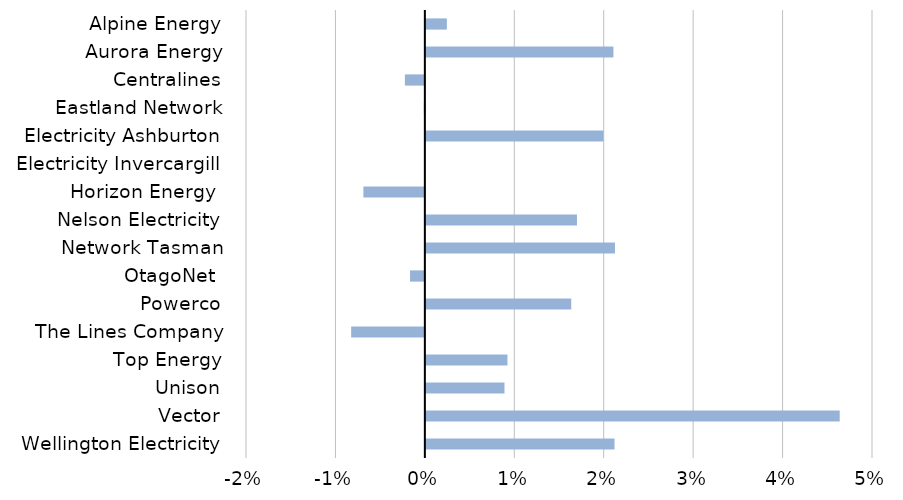
| Category | Series 0 |
|---|---|
| Wellington Electricity | 0.021 |
| Vector | 0.046 |
| Unison | 0.009 |
| Top Energy | 0.009 |
| The Lines Company | -0.008 |
| Powerco | 0.016 |
| OtagoNet  | -0.002 |
| Network Tasman | 0.021 |
| Nelson Electricity | 0.017 |
| Horizon Energy  | -0.007 |
| Electricity Invercargill | 0 |
| Electricity Ashburton | 0.02 |
| Eastland Network | 0 |
| Centralines | -0.002 |
| Aurora Energy | 0.021 |
| Alpine Energy | 0.002 |